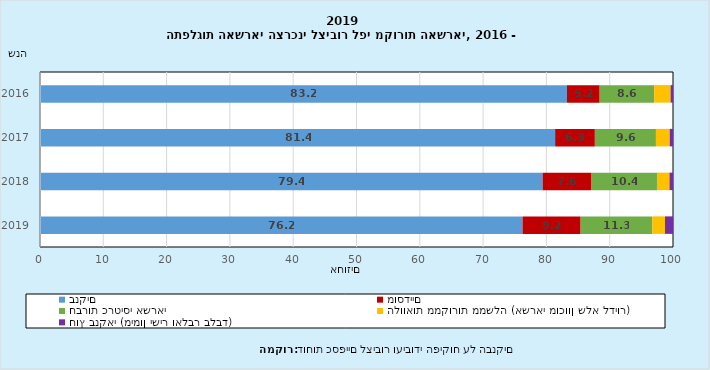
| Category | בנקים | מוסדיים | חברות כרטיסי אשראי | הלוואות ממקורות ממשלה (אשראי מוכוון שלא לדיור) | חוץ בנקאי (מימון ישיר ואלבר בלבד) |
|---|---|---|---|---|---|
| 2019.0 | 76.232 | 9.175 | 11.323 | 2.001 | 1.269 |
| 2018.0 | 79.403 | 7.642 | 10.425 | 1.974 | 0.557 |
| 2017.0 | 81.38 | 6.276 | 9.647 | 2.178 | 0.519 |
| 2016.0 | 83.244 | 5.172 | 8.621 | 2.586 | 0.377 |